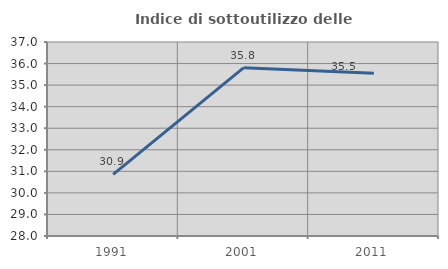
| Category | Indice di sottoutilizzo delle abitazioni  |
|---|---|
| 1991.0 | 30.862 |
| 2001.0 | 35.801 |
| 2011.0 | 35.547 |